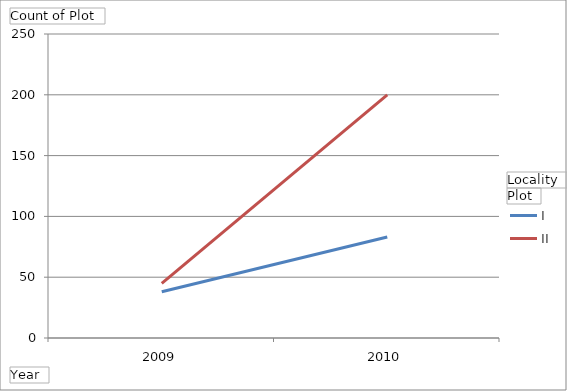
| Category | Manheim - I | Manheim - II |
|---|---|---|
| 2009 | 38 | 45 |
| 2010 | 83 | 200 |